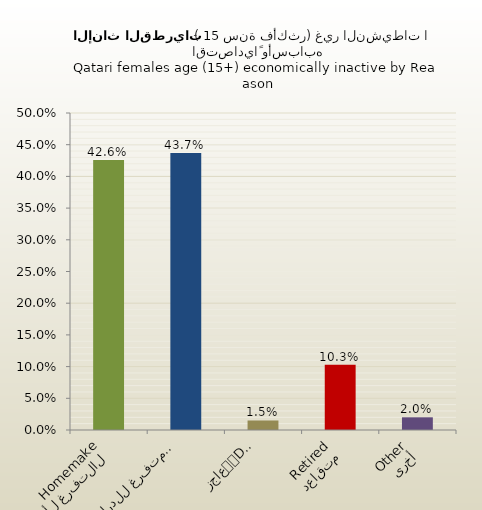
| Category | الاناث القطريات |
|---|---|
| التفرغ لأعمال المنزل
Homemaker | 0.426 |
| متفرغ للدراسة
Student | 0.437 |
| عاجز
Disabled | 0.015 |
| متقاعد
Retired | 0.103 |
| أخرى
Other | 0.02 |